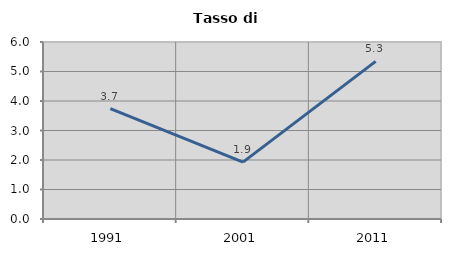
| Category | Tasso di disoccupazione   |
|---|---|
| 1991.0 | 3.742 |
| 2001.0 | 1.927 |
| 2011.0 | 5.344 |